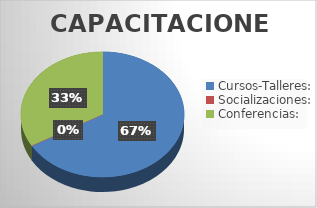
| Category | Series 0 |
|---|---|
| Cursos-Talleres: | 4 |
| Socializaciones: | 0 |
| Conferencias: | 2 |